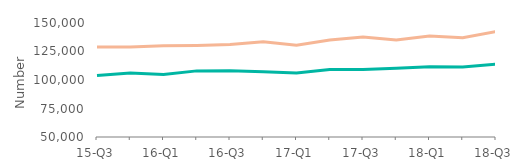
| Category | First-time
buyers | Home movers |
|---|---|---|
| 15-Q3 | 103999 | 128995 |
| 15-Q4 | 106200 | 128995 |
| 16-Q1 | 104760 | 130000 |
| 16-Q2 | 108000 | 130294 |
| 16-Q3 | 108015 | 131037.5 |
| 16-Q4 | 107270.5 | 133650 |
| 17-Q1 | 106232.5 | 130450 |
| 17-Q2 | 109250 | 135000 |
| 17-Q3 | 109299 | 137750 |
| 17-Q4 | 110250 | 135000 |
| 18-Q1 | 111625 | 138500 |
| 18-Q2 | 111500 | 137000 |
| 18-Q3 | 113950 | 142499 |